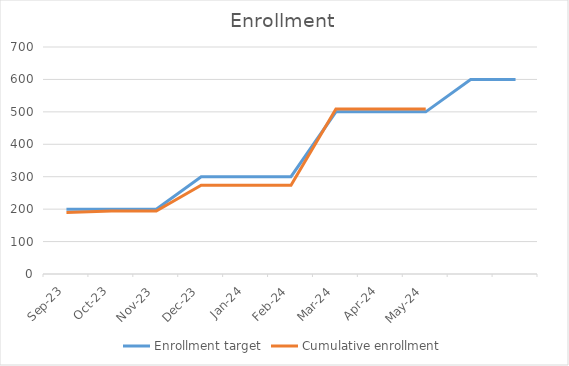
| Category | Enrollment target | Cumulative enrollment |
|---|---|---|
| Sep-23 | 200 | 190 |
| Oct-23 | 200 | 194 |
| Nov-23 | 200 | 194 |
| Dec-23 | 300 | 274 |
| Jan-24 | 300 | 274 |
| Feb-24 | 300 | 274 |
| Mar-24 | 500 | 509 |
| Apr-24 | 500 | 509 |
| May-24 | 500 | 509 |